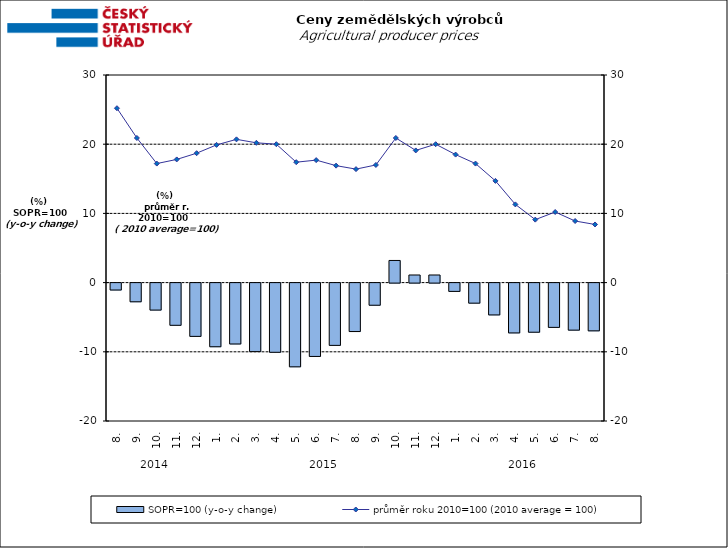
| Category | SOPR=100 (y-o-y change)   |
|---|---|
| 0 | -1 |
| 1 | -2.7 |
| 2 | -3.9 |
| 3 | -6.1 |
| 4 | -7.7 |
| 5 | -9.2 |
| 6 | -8.8 |
| 7 | -9.9 |
| 8 | -10 |
| 9 | -12.1 |
| 10 | -10.6 |
| 11 | -9 |
| 12 | -7 |
| 13 | -3.2 |
| 14 | 3.2 |
| 15 | 1.1 |
| 16 | 1.1 |
| 17 | -1.2 |
| 18 | -2.9 |
| 19 | -4.6 |
| 20 | -7.2 |
| 21 | -7.1 |
| 22 | -6.4 |
| 23 | -6.8 |
| 24 | -6.9 |